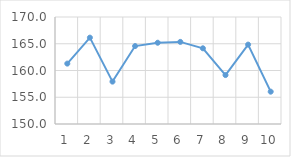
| Category | Series 0 |
|---|---|
| 1.0 | 161.291 |
| 2.0 | 166.14 |
| 3.0 | 157.923 |
| 4.0 | 164.57 |
| 5.0 | 165.189 |
| 6.0 | 165.348 |
| 7.0 | 164.151 |
| 8.0 | 159.148 |
| 9.0 | 164.838 |
| 10.0 | 156.043 |